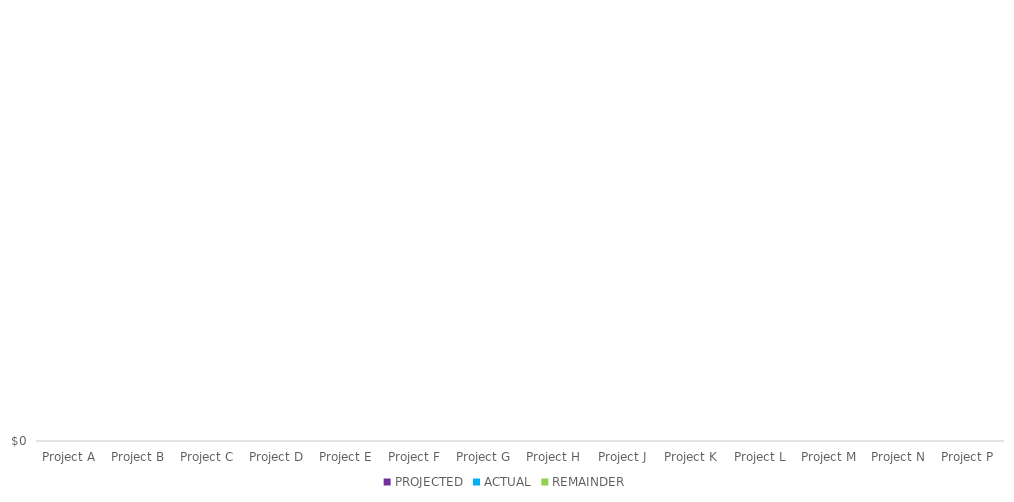
| Category | PROJECTED | ACTUAL | REMAINDER |
|---|---|---|---|
| Project A |  |  | 0 |
| Project B |  |  | 0 |
| Project C |  |  | 0 |
| Project D |  |  | 0 |
| Project E |  |  | 0 |
| Project F |  |  | 0 |
| Project G |  |  | 0 |
| Project H |  |  | 0 |
| Project J |  |  | 0 |
| Project K |  |  | 0 |
| Project L |  |  | 0 |
| Project M |  |  | 0 |
| Project N |  |  | 0 |
| Project P |  |  | 0 |